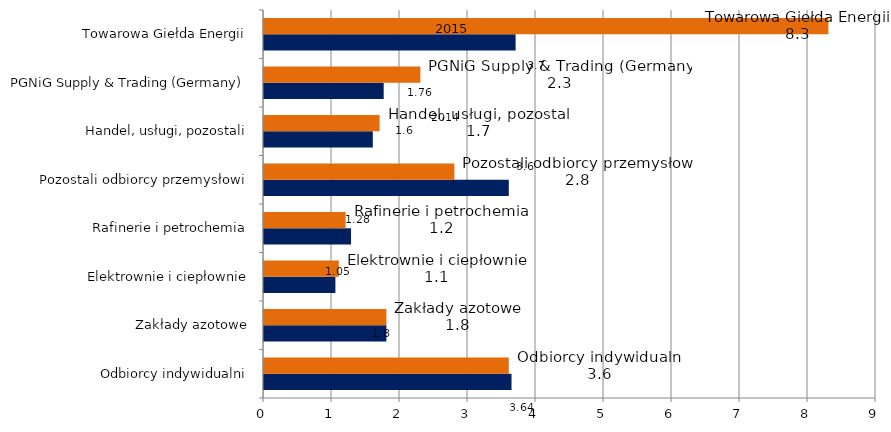
| Category | 2014 | 2015 |
|---|---|---|
| Odbiorcy indywidualni | 3.64 | 3.6 |
| Zakłady azotowe | 1.8 | 1.8 |
| Elektrownie i ciepłownie | 1.05 | 1.1 |
| Rafinerie i petrochemia | 1.28 | 1.2 |
| Pozostali odbiorcy przemysłowi | 3.6 | 2.8 |
| Handel, usługi, pozostali | 1.6 | 1.7 |
| PGNiG Supply & Trading (Germany) | 1.76 | 2.3 |
| Towarowa Giełda Energii | 3.7 | 8.3 |